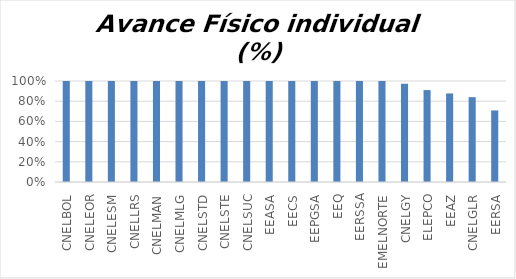
| Category | Avance % |
|---|---|
| CNELBOL | 1 |
| CNELEOR | 1 |
| CNELESM | 1 |
| CNELLRS | 1 |
| CNELMAN | 1 |
| CNELMLG | 1 |
| CNELSTD | 1 |
| CNELSTE | 1 |
| CNELSUC | 1 |
| EEASA | 1 |
| EECS | 1 |
| EEPGSA | 1 |
| EEQ | 1 |
| EERSSA | 1 |
| EMELNORTE | 1 |
| CNELGY | 0.972 |
| ELEPCO | 0.91 |
| EEAZ | 0.877 |
| CNELGLR | 0.84 |
| EERSA | 0.708 |